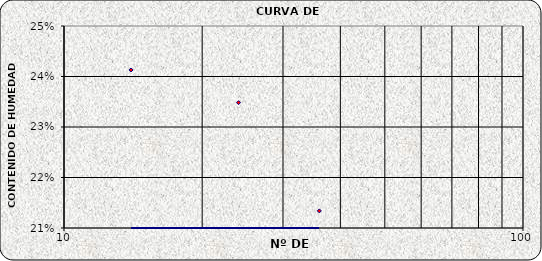
| Category | Series 0 |
|---|---|
| 36.0 | 0.213 |
| 24.0 | 0.235 |
| 14.0 | 0.241 |